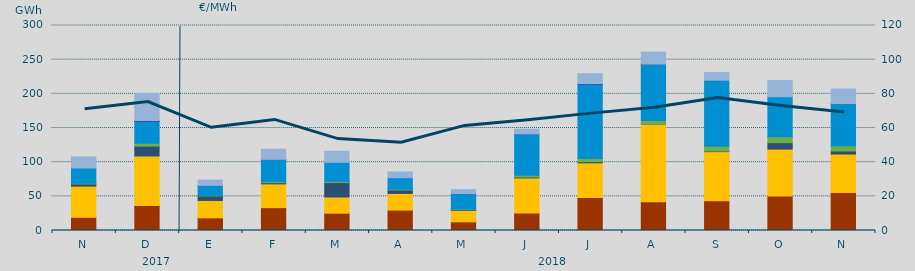
| Category | Carbón | Ciclo Combinado | Cogeneración | Consumo Bombeo | Eólica | Hidráulica | Nuclear | Turbinación bombeo |
|---|---|---|---|---|---|---|---|---|
| N | 19298.3 | 45604 | 0 | 3226 | 983.4 | 22432 | 0 | 16186.5 |
| D | 36464.5 | 72616.8 | 0 | 14393.3 | 4195.1 | 32118.7 | 1236 | 39485.4 |
| E | 18538.8 | 25466.6 | 0 | 6696 | 686 | 14339.3 | 277 | 7767.7 |
| F | 33434.8 | 34817.7 | 0 | 1704 | 1654.6 | 32219.8 | 258 | 14790.9 |
| M | 25308.3 | 23702.3 | 0 | 21100.1 | 1712.3 | 27908.3 | 0 | 16090.2 |
| A | 29845.7 | 24356.1 | 74 | 4947.9 | 1233.1 | 16888.6 | 0 | 8367.7 |
| M | 12672 | 16812.4 | 0 | 952.5 | 730.5 | 23001.2 | 0 | 5631.5 |
| J | 25536.3 | 51382.8 | 0 | 1275.4 | 2784.2 | 59979.3 | 310 | 6998.5 |
| J | 48129.9 | 50935.7 | 0 | 1629.2 | 4531.2 | 109037.6 | 831.6 | 14563.8 |
| A | 41909.8 | 113971.2 | 10 | 188 | 5055.3 | 82431.3 | 20 | 17427.3 |
| S | 43665.8 | 71749.1 | 0 | 763.8 | 7207.5 | 96608.1 | 0 | 11156.8 |
| O | 50474 | 68624.5 | 0 | 9392.7 | 8694 | 58581.5 | 0 | 23733.8 |
| N | 55536.6 | 56365.7 | 0 | 4442.2 | 7624.8 | 61627.7 | 200 | 21168.7 |